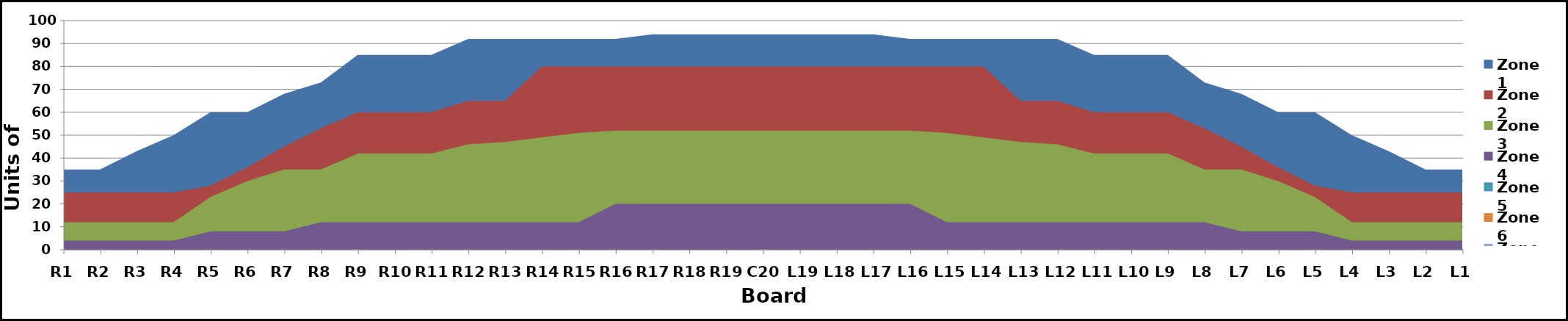
| Category | Zone 1 | Zone 2 | Zone 3 | Zone 4 | Zone 5 | Zone 6 | Zone 7 | Zone 8 |
|---|---|---|---|---|---|---|---|---|
| L1 | 35 | 25 | 12 | 4 | 0 |  |  |  |
| L2 | 35 | 25 | 12 | 4 | 0 |  |  |  |
| L3 | 43 | 25 | 12 | 4 | 0 |  |  |  |
| L4 | 50 | 25 | 12 | 4 | 0 |  |  |  |
| L5 | 60 | 28 | 23 | 8 | 0 |  |  |  |
| L6 | 60 | 36 | 30 | 8 | 0 |  |  |  |
| L7 | 68 | 45 | 35 | 8 | 0 |  |  |  |
| L8 | 73 | 53 | 35 | 12 | 0 |  |  |  |
| L9 | 85 | 60 | 42 | 12 | 0 |  |  |  |
| L10 | 85 | 60 | 42 | 12 | 0 |  |  |  |
| L11 | 85 | 60 | 42 | 12 | 0 |  |  |  |
| L12 | 92 | 65 | 46 | 12 | 0 |  |  |  |
| L13 | 92 | 65 | 47 | 12 | 0 |  |  |  |
| L14 | 92 | 80 | 49 | 12 | 0 |  |  |  |
| L15 | 92 | 80 | 51 | 12 | 0 |  |  |  |
| L16 | 92 | 80 | 52 | 20 | 0 |  |  |  |
| L17 | 94 | 80 | 52 | 20 | 0 |  |  |  |
| L18 | 94 | 80 | 52 | 20 | 0 |  |  |  |
| L19 | 94 | 80 | 52 | 20 | 0 |  |  |  |
| C20 | 94 | 80 | 52 | 20 | 0 |  |  |  |
| R19 | 94 | 80 | 52 | 20 | 0 |  |  |  |
| R18 | 94 | 80 | 52 | 20 | 0 |  |  |  |
| R17 | 94 | 80 | 52 | 20 | 0 |  |  |  |
| R16 | 92 | 80 | 52 | 20 | 0 |  |  |  |
| R15 | 92 | 80 | 51 | 12 | 0 |  |  |  |
| R14 | 92 | 80 | 49 | 12 | 0 |  |  |  |
| R13 | 92 | 65 | 47 | 12 | 0 |  |  |  |
| R12 | 92 | 65 | 46 | 12 | 0 |  |  |  |
| R11 | 85 | 60 | 42 | 12 | 0 |  |  |  |
| R10 | 85 | 60 | 42 | 12 | 0 |  |  |  |
| R9 | 85 | 60 | 42 | 12 | 0 |  |  |  |
| R8 | 73 | 53 | 35 | 12 | 0 |  |  |  |
| R7 | 68 | 45 | 35 | 8 | 0 |  |  |  |
| R6 | 60 | 36 | 30 | 8 | 0 |  |  |  |
| R5 | 60 | 28 | 23 | 8 | 0 |  |  |  |
| R4 | 50 | 25 | 12 | 4 | 0 |  |  |  |
| R3 | 43 | 25 | 12 | 4 | 0 |  |  |  |
| R2 | 35 | 25 | 12 | 4 | 0 |  |  |  |
| R1 | 35 | 25 | 12 | 4 | 0 |  |  |  |